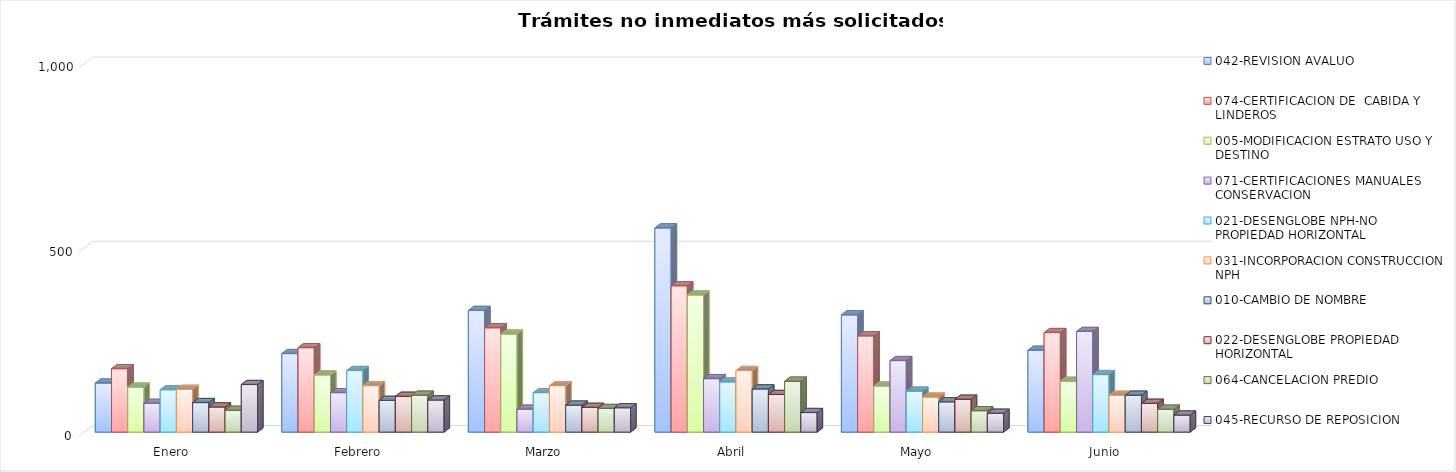
| Category | 042-REVISION AVALUO | 074-CERTIFICACION DE  CABIDA Y LINDEROS  | 005-MODIFICACION ESTRATO USO Y DESTINO | 071-CERTIFICACIONES MANUALES CONSERVACION | 021-DESENGLOBE NPH-NO PROPIEDAD HORIZONTAL | 031-INCORPORACION CONSTRUCCION NPH | 010-CAMBIO DE NOMBRE | 022-DESENGLOBE PROPIEDAD HORIZONTAL | 064-CANCELACION PREDIO | 045-RECURSO DE REPOSICION |
|---|---|---|---|---|---|---|---|---|---|---|
| Enero | 133 | 172 | 122 | 78 | 115 | 116 | 80 | 68 | 59 | 129 |
| Febrero | 213 | 229 | 155 | 107 | 167 | 126 | 86 | 97 | 100 | 87 |
| Marzo | 330 | 283 | 266 | 62 | 107 | 126 | 73 | 67 | 64 | 66 |
| Abril | 554 | 397 | 372 | 145 | 136 | 167 | 117 | 102 | 138 | 53 |
| Mayo | 318 | 261 | 125 | 194 | 111 | 95 | 82 | 89 | 58 | 51 |
| Junio | 222 | 270 | 138 | 273 | 156 | 100 | 100 | 78 | 62 | 46 |